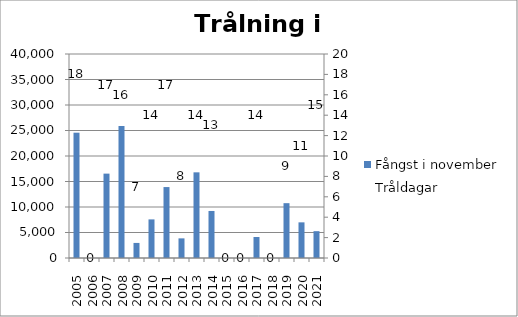
| Category | Fångst i november |
|---|---|
| 2005.0 | 24570 |
| 2006.0 | 0 |
| 2007.0 | 16545 |
| 2008.0 | 25875 |
| 2009.0 | 2955 |
| 2010.0 | 7570 |
| 2011.0 | 13910 |
| 2012.0 | 3850 |
| 2013.0 | 16797 |
| 2014.0 | 9222 |
| 2015.0 | 0 |
| 2016.0 | 0 |
| 2017.0 | 4117 |
| 2018.0 | 0 |
| 2019.0 | 10750 |
| 2020.0 | 6990 |
| 2021.0 | 5260 |